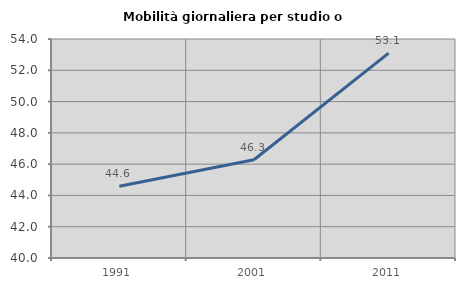
| Category | Mobilità giornaliera per studio o lavoro |
|---|---|
| 1991.0 | 44.585 |
| 2001.0 | 46.28 |
| 2011.0 | 53.094 |